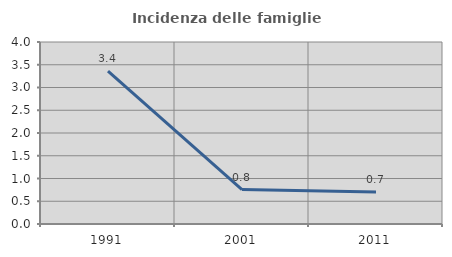
| Category | Incidenza delle famiglie numerose |
|---|---|
| 1991.0 | 3.361 |
| 2001.0 | 0.756 |
| 2011.0 | 0.704 |